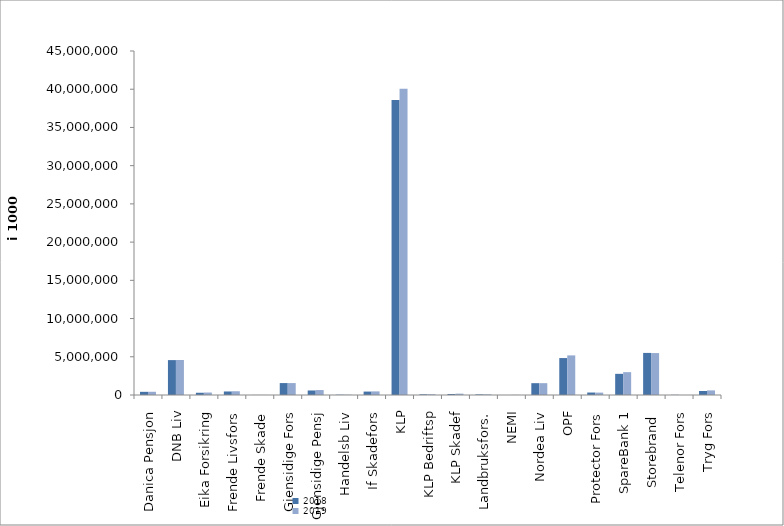
| Category | 2018 | 2019 |
|---|---|---|
| Danica Pensjon | 415883.793 | 421442.946 |
| DNB Liv | 4564526 | 4578461 |
| Eika Forsikring | 293648 | 323640 |
| Frende Livsfors | 461568 | 490047 |
| Frende Skade | 7955 | 8197 |
| Gjensidige Fors | 1560358 | 1559670 |
| Gjensidige Pensj | 591422 | 648034 |
| Handelsb Liv | 35563 | 35020.773 |
| If Skadefors | 447566 | 472830.559 |
| KLP | 38575507.413 | 40071235.121 |
| KLP Bedriftsp | 89195 | 96824 |
| KLP Skadef | 134230.552 | 175357 |
| Landbruksfors. | 75514 | 83630 |
| NEMI | 1788 | 17501.088 |
| Nordea Liv | 1546969.243 | 1547946.083 |
| OPF | 4832000 | 5181000 |
| Protector Fors | 322909.73 | 312787.175 |
| SpareBank 1 | 2769109.261 | 2988164.167 |
| Storebrand  | 5505079.228 | 5485806.5 |
| Telenor Fors | 22616 | 1989 |
| Tryg Fors | 525057.896 | 601419.671 |